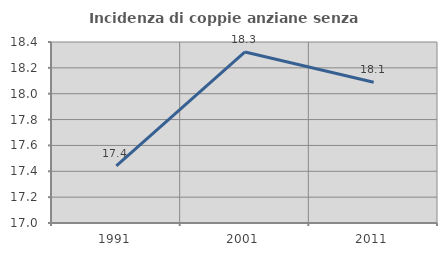
| Category | Incidenza di coppie anziane senza figli  |
|---|---|
| 1991.0 | 17.442 |
| 2001.0 | 18.323 |
| 2011.0 | 18.089 |